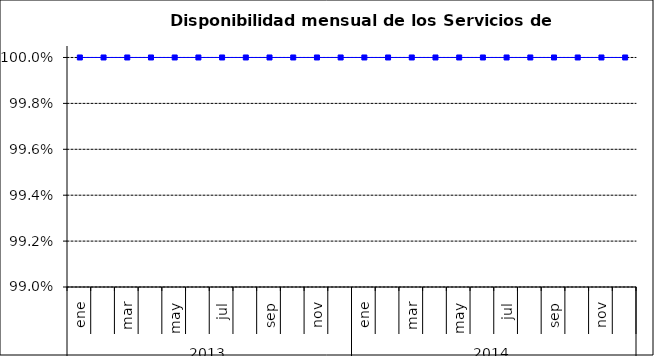
| Category | SCL |
|---|---|
| 0 | 1 |
| 1 | 1 |
| 2 | 1 |
| 3 | 1 |
| 4 | 1 |
| 5 | 1 |
| 6 | 1 |
| 7 | 1 |
| 8 | 1 |
| 9 | 1 |
| 10 | 1 |
| 11 | 1 |
| 12 | 1 |
| 13 | 1 |
| 14 | 1 |
| 15 | 1 |
| 16 | 1 |
| 17 | 1 |
| 18 | 1 |
| 19 | 1 |
| 20 | 1 |
| 21 | 1 |
| 22 | 1 |
| 23 | 1 |